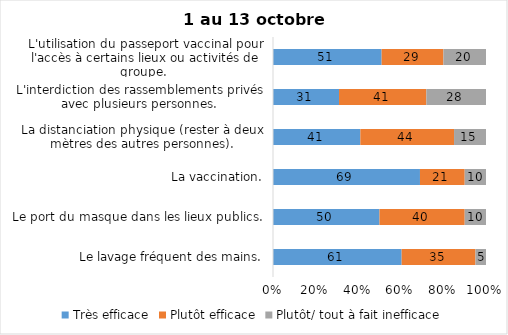
| Category | Très efficace | Plutôt efficace | Plutôt/ tout à fait inefficace |
|---|---|---|---|
| Le lavage fréquent des mains. | 61 | 35 | 5 |
| Le port du masque dans les lieux publics. | 50 | 40 | 10 |
| La vaccination. | 69 | 21 | 10 |
| La distanciation physique (rester à deux mètres des autres personnes). | 41 | 44 | 15 |
| L'interdiction des rassemblements privés avec plusieurs personnes. | 31 | 41 | 28 |
| L'utilisation du passeport vaccinal pour l'accès à certains lieux ou activités de groupe.  | 51 | 29 | 20 |